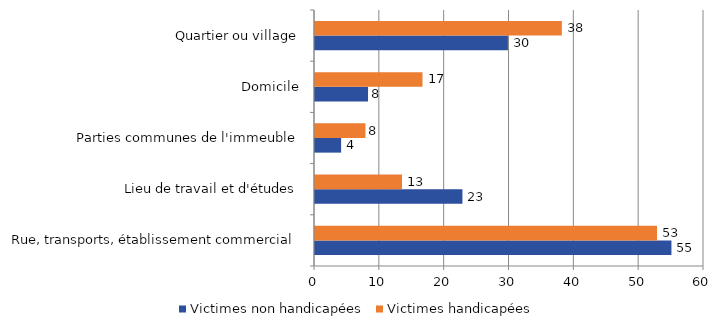
| Category | Victimes non handicapées | Victimes handicapées |
|---|---|---|
| Rue, transports, établissement commercial | 54.977 | 52.755 |
| Lieu de travail et d'études | 22.738 | 13.417 |
| Parties communes de l'immeuble | 4.03 | 7.781 |
| Domicile | 8.178 | 16.583 |
| Quartier ou village | 29.754 | 38.074 |